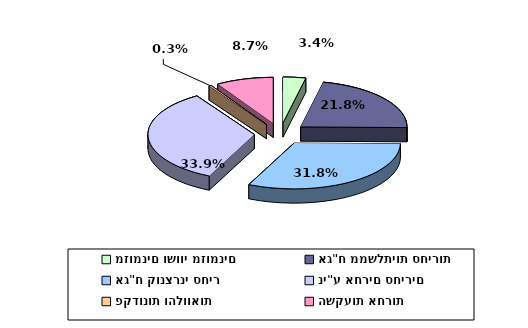
| Category | Series 0 |
|---|---|
| מזומנים ושווי מזומנים | 0.034 |
| אג"ח ממשלתיות סחירות | 0.218 |
| אג"ח קונצרני סחיר | 0.318 |
| ני"ע אחרים סחירים | 0.339 |
| פקדונות והלוואות | 0.003 |
| השקעות אחרות | 0.087 |